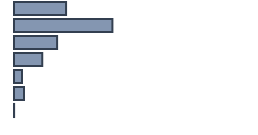
| Category | Percentatge |
|---|---|
| 0 | 21.696 |
| 1 | 41 |
| 2 | 17.957 |
| 3 | 11.739 |
| 4 | 3.348 |
| 5 | 4.217 |
| 6 | 0.043 |